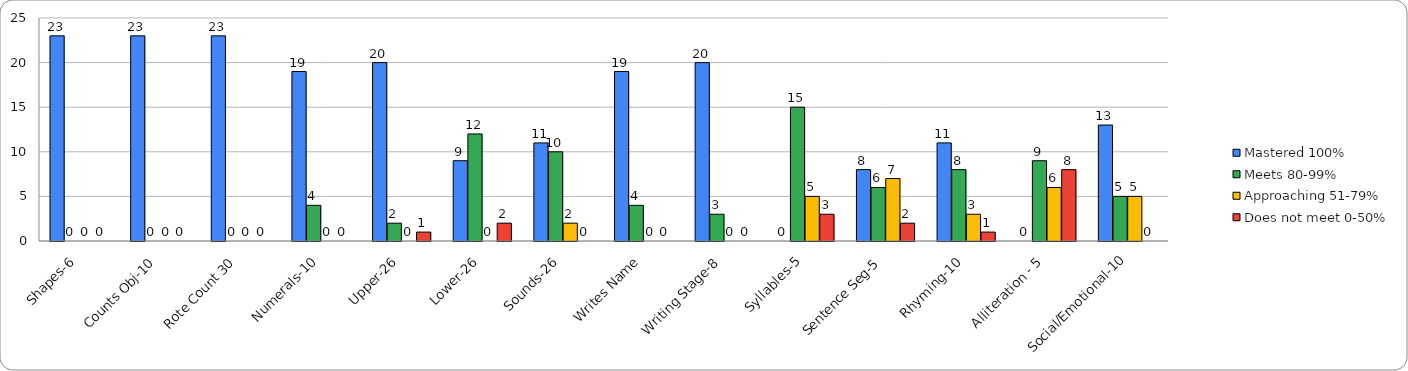
| Category | Mastered 100% | Meets 80-99% | Approaching 51-79% | Does not meet 0-50% |
|---|---|---|---|---|
| Shapes-6 | 23 | 0 | 0 | 0 |
| Counts Obj-10 | 23 | 0 | 0 | 0 |
| Rote Count 30 | 23 | 0 | 0 | 0 |
| Numerals-10 | 19 | 4 | 0 | 0 |
| Upper-26 | 20 | 2 | 0 | 1 |
| Lower-26 | 9 | 12 | 0 | 2 |
| Sounds-26 | 11 | 10 | 2 | 0 |
| Writes Name | 19 | 4 | 0 | 0 |
| Writing Stage-8 | 20 | 3 | 0 | 0 |
| Syllables-5 | 0 | 15 | 5 | 3 |
| Sentence Seg-5 | 8 | 6 | 7 | 2 |
| Rhyming-10 | 11 | 8 | 3 | 1 |
| Alliteration - 5 | 0 | 9 | 6 | 8 |
| Social/Emotional-10 | 13 | 5 | 5 | 0 |